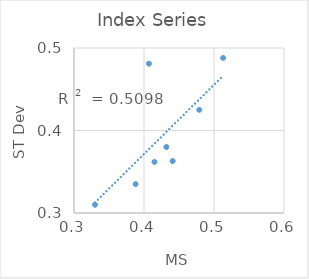
| Category | ind-stdev |
|---|---|
| 0.441 | 0.363 |
| 0.415 | 0.362 |
| 0.513 | 0.488 |
| 0.479 | 0.425 |
| 0.33 | 0.31 |
| 0.407 | 0.481 |
| 0.432 | 0.38 |
| 0.388 | 0.335 |